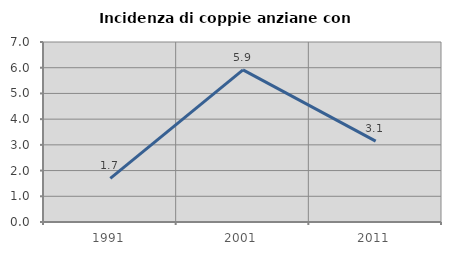
| Category | Incidenza di coppie anziane con figli |
|---|---|
| 1991.0 | 1.695 |
| 2001.0 | 5.917 |
| 2011.0 | 3.145 |